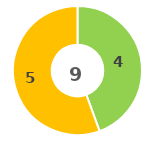
| Category | Series 0 |
|---|---|
| 0 | 0 |
| 1 | 4 |
| 2 | 5 |
| 3 | 0 |
| 4 | 0 |